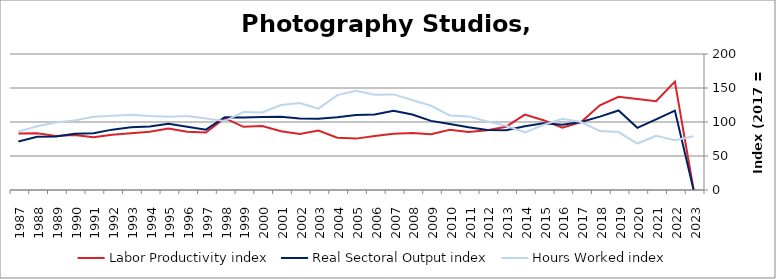
| Category | Labor Productivity index | Real Sectoral Output index | Hours Worked index |
|---|---|---|---|
| 2023.0 | 0 | 0 | 78.99 |
| 2022.0 | 159.495 | 116.826 | 73.247 |
| 2021.0 | 130.592 | 103.907 | 79.567 |
| 2020.0 | 133.729 | 91.41 | 68.355 |
| 2019.0 | 137.179 | 116.949 | 85.253 |
| 2018.0 | 124.462 | 107.9 | 86.693 |
| 2017.0 | 100 | 100 | 100 |
| 2016.0 | 91.594 | 95.981 | 104.79 |
| 2015.0 | 102.673 | 98.285 | 95.726 |
| 2014.0 | 110.956 | 93.867 | 84.598 |
| 2013.0 | 93.085 | 87.846 | 94.371 |
| 2012.0 | 87.814 | 88.392 | 100.659 |
| 2011.0 | 85.124 | 92.142 | 108.245 |
| 2010.0 | 88.589 | 97.041 | 109.541 |
| 2009.0 | 82.076 | 101.647 | 123.845 |
| 2008.0 | 83.905 | 111.031 | 132.328 |
| 2007.0 | 82.74 | 116.342 | 140.61 |
| 2006.0 | 79.372 | 111.072 | 139.939 |
| 2005.0 | 75.56 | 110.187 | 145.828 |
| 2004.0 | 76.775 | 107.121 | 139.526 |
| 2003.0 | 87.476 | 104.697 | 119.686 |
| 2002.0 | 82.229 | 105.196 | 127.932 |
| 2001.0 | 86.367 | 107.863 | 124.89 |
| 2000.0 | 94.049 | 107.172 | 113.953 |
| 1999.0 | 92.9 | 106.682 | 114.836 |
| 1998.0 | 105.67 | 107.091 | 101.345 |
| 1997.0 | 84.473 | 88.683 | 104.984 |
| 1996.0 | 85.511 | 92.92 | 108.664 |
| 1995.0 | 90.432 | 97.465 | 107.776 |
| 1994.0 | 85.787 | 93.477 | 108.964 |
| 1993.0 | 83.484 | 92.246 | 110.495 |
| 1992.0 | 81.263 | 88.773 | 109.242 |
| 1991.0 | 77.548 | 83.468 | 107.634 |
| 1990.0 | 81.014 | 82.875 | 102.297 |
| 1989.0 | 79.348 | 78.752 | 99.249 |
| 1988.0 | 83.518 | 78.217 | 93.653 |
| 1987.0 | 82.985 | 71.276 | 85.891 |